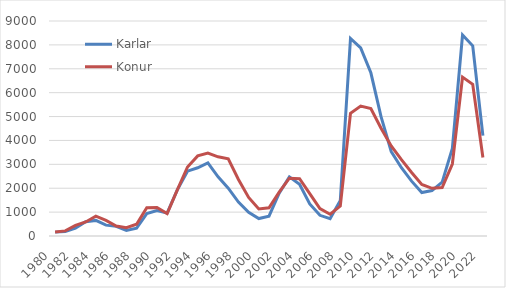
| Category | Karlar | Konur |
|---|---|---|
| 1980.0 | 162.11 | 169.201 |
| 1981.0 | 192.873 | 214.538 |
| 1982.0 | 325.791 | 443.186 |
| 1983.0 | 600.417 | 586.5 |
| 1984.0 | 652.917 | 827.75 |
| 1985.0 | 454.5 | 650.167 |
| 1986.0 | 403.917 | 418.917 |
| 1987.0 | 236.667 | 347.417 |
| 1988.0 | 324.667 | 494.917 |
| 1989.0 | 937.833 | 1187.333 |
| 1990.0 | 1063.083 | 1192.25 |
| 1991.0 | 958.583 | 941.917 |
| 1992.0 | 1934.167 | 1933.667 |
| 1993.0 | 2712.583 | 2888.833 |
| 1994.0 | 2856.583 | 3352.083 |
| 1995.0 | 3062.917 | 3475.5 |
| 1996.0 | 2476.583 | 3314.417 |
| 1997.0 | 2003 | 3227.417 |
| 1998.0 | 1421.917 | 2366.5 |
| 1999.0 | 990.083 | 1612 |
| 2000.0 | 731 | 1134 |
| 2001.0 | 830 | 1179 |
| 2002.0 | 1794 | 1837 |
| 2003.0 | 2474 | 2419 |
| 2004.0 | 2166 | 2398 |
| 2005.0 | 1343 | 1776 |
| 2006.0 | 866 | 1150 |
| 2007.0 | 721.417 | 910.833 |
| 2008.0 | 1491.333 | 1253.167 |
| 2009.0 | 8269.75 | 5137 |
| 2010.0 | 7872.917 | 5435.75 |
| 2011.0 | 6831.667 | 5335.667 |
| 2012.0 | 4996.5 | 4508.333 |
| 2013.0 | 3536 | 3768 |
| 2014.0 | 2858 | 3194.583 |
| 2015.0 | 2296.083 | 2659 |
| 2016.0 | 1820.333 | 2158.667 |
| 2017.0 | 1902.333 | 1996.667 |
| 2018.0 | 2254.833 | 2027.667 |
| 2019.0 | 3666.167 | 3014.167 |
| 2020.0 | 8412.583 | 6653.417 |
| 2021.0 | 7960.833 | 6352.25 |
| 2022.0 | 4201.5 | 3285.25 |